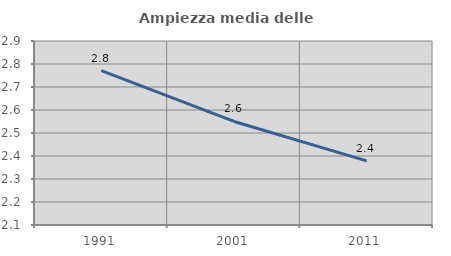
| Category | Ampiezza media delle famiglie |
|---|---|
| 1991.0 | 2.771 |
| 2001.0 | 2.55 |
| 2011.0 | 2.379 |